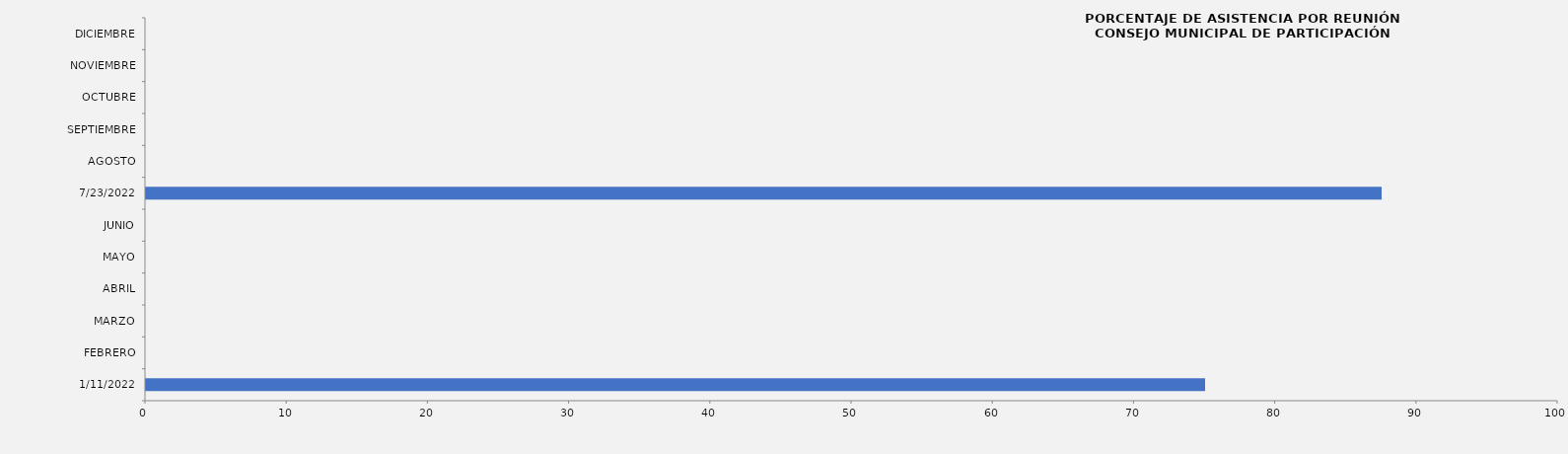
| Category | Series 0 |
|---|---|
| 11/01/2022 | 75 |
| FEBRERO | 0 |
| MARZO | 0 |
| ABRIL | 0 |
| MAYO | 0 |
| JUNIO | 0 |
| 23/07/2022 | 87.5 |
| AGOSTO | 0 |
| SEPTIEMBRE | 0 |
| OCTUBRE | 0 |
| NOVIEMBRE | 0 |
| DICIEMBRE | 0 |